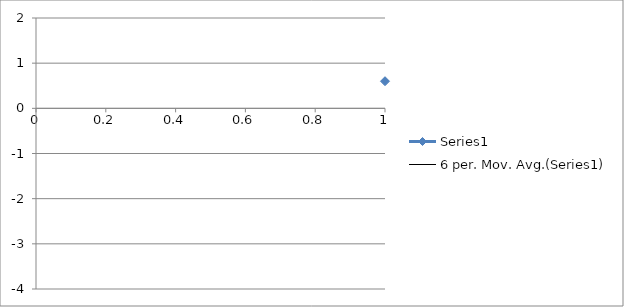
| Category | Series 0 |
|---|---|
| 0 | 0.6 |
| 1 | -2.3 |
| 2 | -3 |
| 3 | 1.5 |
| 4 | -1.6 |
| 5 | -2.1 |
| 6 | -0.4 |
| 7 | -0.5 |
| 8 | -2.8 |
| 9 | 0.5 |
| 10 | -0.8 |
| 11 | -0.1 |
| 12 | -3.5 |
| 13 | 1.6 |
| 14 | -1.1 |